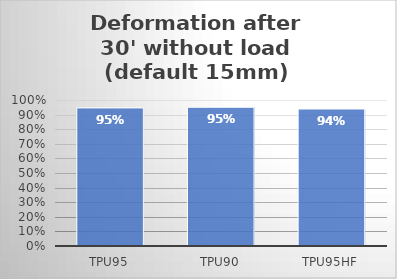
| Category | % |
|---|---|
| TPU95 | 0.946 |
| TPU90 | 0.95 |
| TPU95HF | 0.938 |